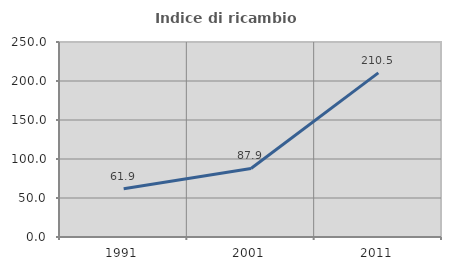
| Category | Indice di ricambio occupazionale  |
|---|---|
| 1991.0 | 61.889 |
| 2001.0 | 87.916 |
| 2011.0 | 210.463 |